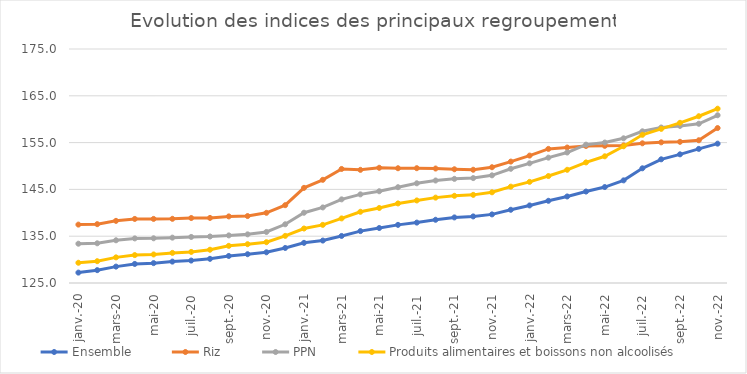
| Category |  Ensemble  |  Riz  |  PPN  |  Produits alimentaires et boissons non alcoolisés  |
|---|---|---|---|---|
| 2020-01-01 | 127.22 | 137.477 | 133.394 | 129.324 |
| 2020-02-01 | 127.747 | 137.571 | 133.482 | 129.658 |
| 2020-03-01 | 128.503 | 138.279 | 134.127 | 130.477 |
| 2020-04-01 | 129.073 | 138.691 | 134.528 | 130.962 |
| 2020-05-01 | 129.246 | 138.695 | 134.553 | 131.1 |
| 2020-06-01 | 129.569 | 138.715 | 134.691 | 131.433 |
| 2020-07-01 | 129.792 | 138.884 | 134.842 | 131.639 |
| 2020-08-01 | 130.165 | 138.908 | 134.939 | 132.108 |
| 2020-09-01 | 130.779 | 139.227 | 135.17 | 132.94 |
| 2020-10-01 | 131.152 | 139.307 | 135.396 | 133.293 |
| 2020-11-01 | 131.562 | 139.996 | 135.904 | 133.717 |
| 2020-12-01 | 132.488 | 141.627 | 137.548 | 135.07 |
| 2021-01-01 | 133.582 | 145.33 | 140.014 | 136.64 |
| 2021-02-01 | 134.068 | 147.047 | 141.147 | 137.422 |
| 2021-03-01 | 135.051 | 149.367 | 142.872 | 138.8 |
| 2021-04-01 | 136.088 | 149.178 | 143.938 | 140.217 |
| 2021-05-01 | 136.75 | 149.619 | 144.606 | 141.028 |
| 2021-06-01 | 137.421 | 149.519 | 145.469 | 142.002 |
| 2021-07-01 | 137.905 | 149.532 | 146.302 | 142.639 |
| 2021-08-01 | 138.51 | 149.461 | 146.899 | 143.242 |
| 2021-09-01 | 139.014 | 149.302 | 147.252 | 143.631 |
| 2021-10-01 | 139.227 | 149.196 | 147.416 | 143.832 |
| 2021-11-01 | 139.66 | 149.736 | 148.006 | 144.381 |
| 2021-12-01 | 140.647 | 150.942 | 149.401 | 145.589 |
| 2022-01-01 | 141.575 | 152.225 | 150.572 | 146.611 |
| 2022-02-01 | 142.565 | 153.658 | 151.785 | 147.854 |
| 2022-03-01 | 143.49 | 153.947 | 152.881 | 149.188 |
| 2022-04-01 | 144.542 | 154.286 | 154.56 | 150.765 |
| 2022-05-01 | 145.5 | 154.308 | 155.011 | 152.074 |
| 2022-06-01 | 146.929 | 154.397 | 155.916 | 154.212 |
| 2022-07-01 | 149.51 | 154.848 | 157.411 | 156.664 |
| 2022-08-01 | 151.429 | 155.056 | 158.224 | 157.93 |
| 2022-09-01 | 152.495 | 155.168 | 158.567 | 159.229 |
| 2022-10-01 | 153.659 | 155.499 | 159.025 | 160.634 |
| 2022-11-01 | 154.778 | 158.112 | 160.842 | 162.244 |